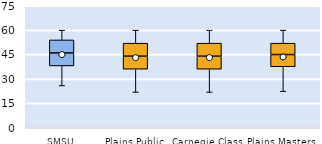
| Category | 25th | 50th | 75th |
|---|---|---|---|
| SMSU | 38 | 8 | 8 |
| Plains Public | 36 | 8 | 8 |
| Carnegie Class | 36 | 8 | 8 |
| Plains Masters | 37.5 | 7.5 | 7 |